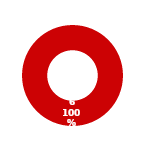
| Category | EDM |
|---|---|
| MIL 3 Complete | 0 |
| MIL 3 Not Complete | 6 |